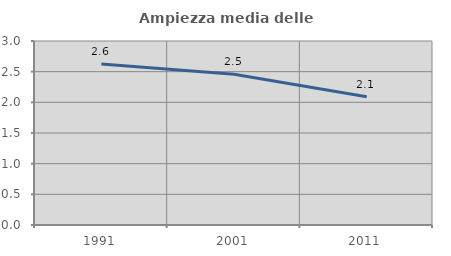
| Category | Ampiezza media delle famiglie |
|---|---|
| 1991.0 | 2.624 |
| 2001.0 | 2.457 |
| 2011.0 | 2.091 |